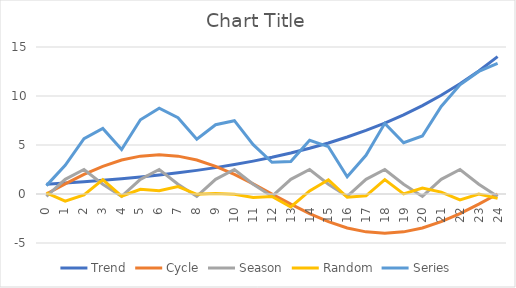
| Category | Trend | Cycle | Season | Random | Series |
|---|---|---|---|---|---|
| 0.0 | 1 | 0 | -0.25 | 0.105 | 0.855 |
| 1.0 | 1.116 | 1.035 | 1.5 | -0.729 | 2.923 |
| 2.0 | 1.246 | 2 | 2.5 | -0.095 | 5.651 |
| 3.0 | 1.391 | 2.828 | 1 | 1.465 | 6.685 |
| 4.0 | 1.553 | 3.464 | -0.25 | -0.229 | 4.538 |
| 5.0 | 1.733 | 3.864 | 1.5 | 0.482 | 7.579 |
| 6.0 | 1.935 | 4 | 2.5 | 0.329 | 8.764 |
| 7.0 | 2.16 | 3.864 | 1 | 0.762 | 7.786 |
| 8.0 | 2.411 | 3.464 | -0.25 | -0.036 | 5.589 |
| 9.0 | 2.691 | 2.828 | 1.5 | 0.051 | 7.07 |
| 10.0 | 3.004 | 2 | 2.5 | -0.024 | 7.48 |
| 11.0 | 3.353 | 1.035 | 1 | -0.357 | 5.032 |
| 12.0 | 3.743 | 0 | -0.25 | -0.259 | 3.235 |
| 13.0 | 4.179 | -1.035 | 1.5 | -1.326 | 3.317 |
| 14.0 | 4.665 | -2 | 2.5 | 0.317 | 5.482 |
| 15.0 | 5.207 | -2.828 | 1 | 1.449 | 4.827 |
| 16.0 | 5.812 | -3.464 | -0.25 | -0.338 | 1.761 |
| 17.0 | 6.488 | -3.864 | 1.5 | -0.18 | 3.945 |
| 18.0 | 7.243 | -4 | 2.5 | 1.467 | 7.21 |
| 19.0 | 8.085 | -3.864 | 1 | 0.013 | 5.234 |
| 20.0 | 9.025 | -3.464 | -0.25 | 0.609 | 5.92 |
| 21.0 | 10.074 | -2.828 | 1.5 | 0.192 | 8.938 |
| 22.0 | 11.246 | -2 | 2.5 | -0.611 | 11.135 |
| 23.0 | 12.554 | -1.035 | 1 | -0.011 | 12.507 |
| 24.0 | 14.013 | 0 | -0.25 | -0.446 | 13.317 |